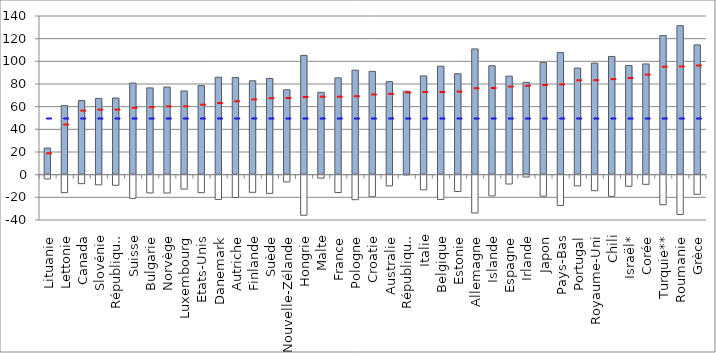
| Category | Revenus brut | Impôts nets | Transferts nets |
|---|---|---|---|
| Lituanie | 23.458 | -4.181 | 0 |
| Lettonie | 60.96 | -16.317 | 0 |
| Canada | 65.34 | -8.364 | 0 |
| Slovénie | 67.265 | -9.425 | 0 |
| République slovaque | 67.662 | -9.785 | 0 |
| Suisse | 80.834 | -21.329 | 0 |
| Bulgarie | 76.55 | -16.543 | 0 |
| Norvège | 77.337 | -16.657 | 0 |
| Luxembourg | 73.858 | -13.161 | 0 |
| Etats-Unis | 78.545 | -16.339 | 0 |
| Danemark | 85.948 | -22.259 | 0 |
| Autriche | 85.711 | -20.581 | 0 |
| Finlande | 82.826 | -16.002 | 0 |
| Suède | 84.828 | -16.945 | 0 |
| Nouvelle-Zélande | 74.875 | -6.852 | 0 |
| Hongrie | 105.191 | -36.291 | 0 |
| Malte | 72.706 | -3.469 | 0 |
| France | 85.397 | -16.156 | 0 |
| Pologne | 92.163 | -22.54 | 0 |
| Croatie | 91.153 | -19.965 | 0 |
| Australie | 82.088 | -10.338 | 0 |
| République tchèque | 73.586 | -0.643 | 0 |
| Italie | 87.162 | -13.847 | 0 |
| Belgique | 95.715 | -22.277 | 0 |
| Estonie | 89.083 | -15.334 | 0 |
| Allemagne | 110.931 | -34.271 | 0 |
| Islande | 96.105 | -19.198 | 0 |
| Espagne | 86.909 | -8.685 | 0 |
| Irlande | 81.447 | -2.508 | 0 |
| Japon | 99.03 | -19.437 | 0 |
| Pays-Bas | 107.682 | -27.597 | 0 |
| Portugal | 94.052 | -10.346 | 0 |
| Royaume-Uni | 98.409 | -14.588 | 0 |
| Chili | 104.319 | -19.57 | 0 |
| Israël* | 96.332 | -10.682 | 0 |
| Corée | 97.702 | -8.963 | 0 |
| Turquie** | 122.678 | -26.962 | 0 |
| Roumanie | 131.503 | -35.619 | 0 |
| Grèce | 114.521 | -17.751 | 0 |